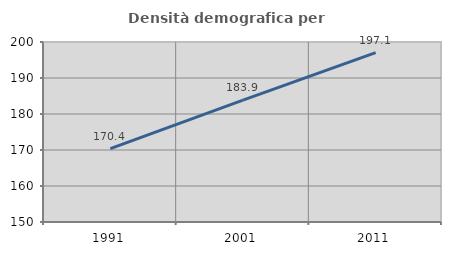
| Category | Densità demografica |
|---|---|
| 1991.0 | 170.369 |
| 2001.0 | 183.868 |
| 2011.0 | 197.055 |